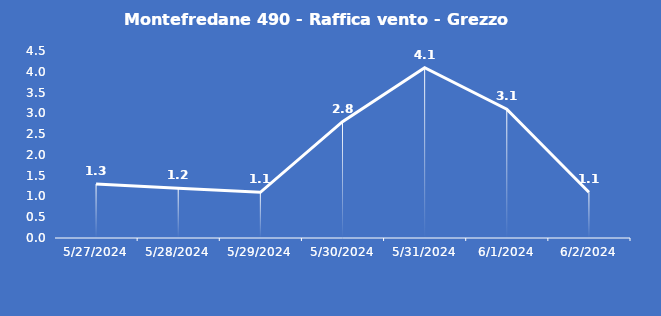
| Category | Montefredane 490 - Raffica vento - Grezzo (m/s) |
|---|---|
| 5/27/24 | 1.3 |
| 5/28/24 | 1.2 |
| 5/29/24 | 1.1 |
| 5/30/24 | 2.8 |
| 5/31/24 | 4.1 |
| 6/1/24 | 3.1 |
| 6/2/24 | 1.1 |